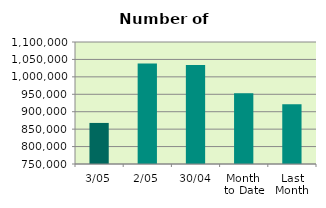
| Category | Series 0 |
|---|---|
| 3/05 | 867814 |
| 2/05 | 1038430 |
| 30/04 | 1034372 |
| Month 
to Date | 953122 |
| Last
Month | 921109.3 |